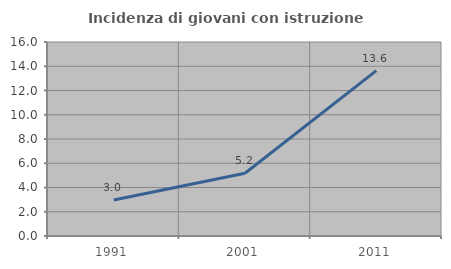
| Category | Incidenza di giovani con istruzione universitaria |
|---|---|
| 1991.0 | 2.963 |
| 2001.0 | 5.172 |
| 2011.0 | 13.636 |